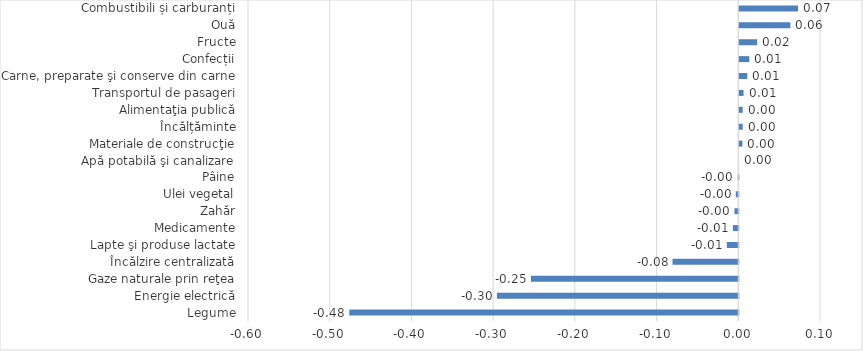
| Category | Series 0 |
|---|---|
| Legume | -0.476 |
| Energie electrică | -0.295 |
| Gaze naturale prin reţea | -0.254 |
| Încălzire centralizată | -0.08 |
| Lapte şi produse lactate | -0.014 |
| Medicamente | -0.007 |
| Zahăr | -0.005 |
| Ulei vegetal | -0.003 |
| Pâine | -0.001 |
| Apă potabilă şi canalizare | 0 |
| Materiale de construcţie | 0.004 |
| Încălțăminte | 0.004 |
| Alimentaţia publică | 0.004 |
| Transportul de pasageri | 0.005 |
| Carne, preparate şi conserve din carne | 0.01 |
| Confecții | 0.012 |
| Fructe | 0.022 |
| Ouă | 0.063 |
| Combustibili și carburanți | 0.072 |